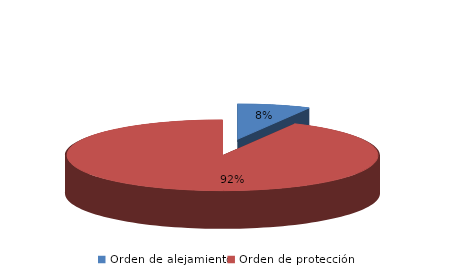
| Category | Series 0 |
|---|---|
| Orden de alejamiento | 51 |
| Orden de protección | 625 |